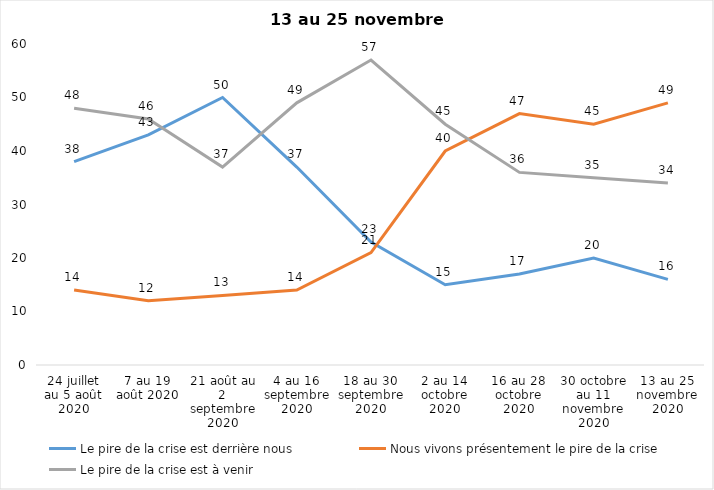
| Category | Le pire de la crise est derrière nous | Nous vivons présentement le pire de la crise | Le pire de la crise est à venir |
|---|---|---|---|
| 24 juillet au 5 août 2020 | 38 | 14 | 48 |
| 7 au 19 août 2020 | 43 | 12 | 46 |
| 21 août au 2 septembre 2020 | 50 | 13 | 37 |
| 4 au 16 septembre 2020 | 37 | 14 | 49 |
| 18 au 30 septembre 2020 | 23 | 21 | 57 |
| 2 au 14 octobre 2020 | 15 | 40 | 45 |
| 16 au 28 octobre 2020 | 17 | 47 | 36 |
| 30 octobre au 11 novembre 2020 | 20 | 45 | 35 |
| 13 au 25 novembre 2020 | 16 | 49 | 34 |